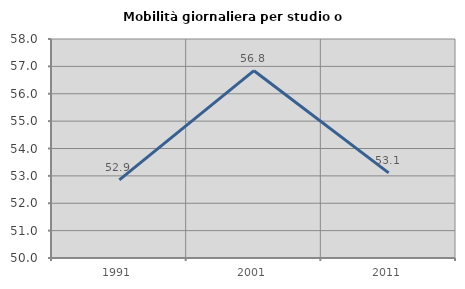
| Category | Mobilità giornaliera per studio o lavoro |
|---|---|
| 1991.0 | 52.852 |
| 2001.0 | 56.842 |
| 2011.0 | 53.111 |